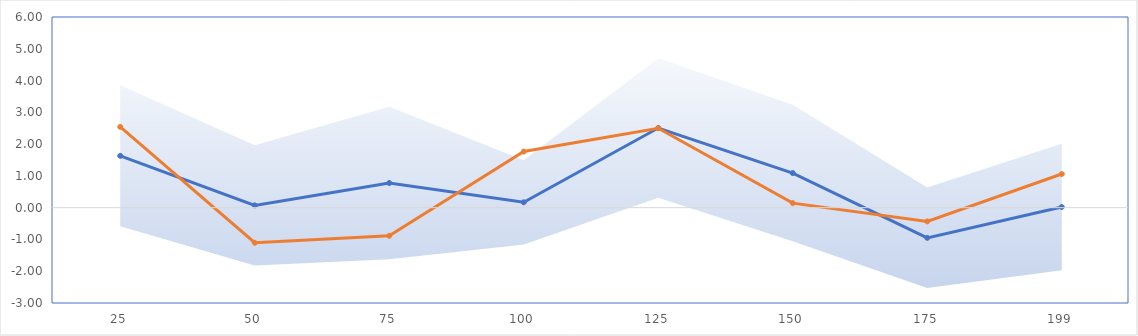
| Category | Series 0 | Series 1 |
|---|---|---|
| 25.0 | 1.632 | 2.542 |
| 50.0 | 0.072 | -1.104 |
| 75.0 | 0.776 | -0.885 |
| 100.0 | 0.169 | 1.766 |
| 125.0 | 2.507 | 2.499 |
| 150.0 | 1.088 | 0.143 |
| 175.0 | -0.95 | -0.433 |
| 199.0 | 0.021 | 1.058 |